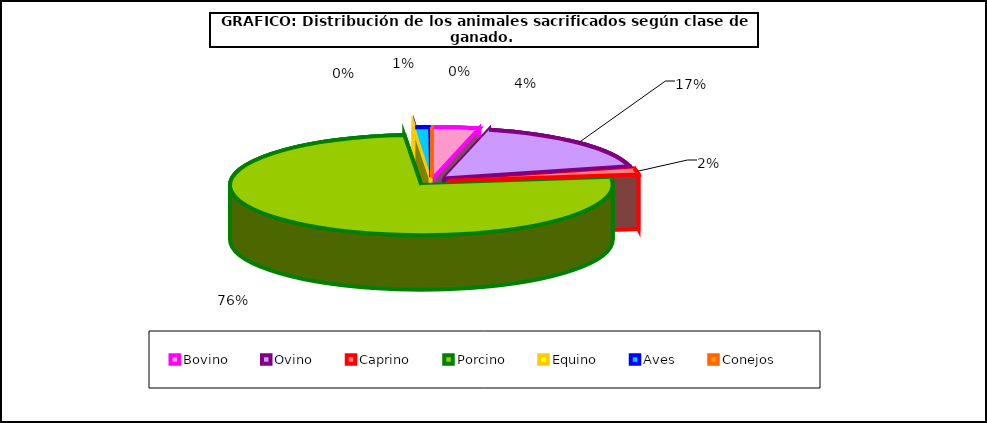
| Category | Series 0 |
|---|---|
| 0 | 2182590 |
| 1 | 9928191 |
| 2 | 1130215 |
| 3 | 43483573 |
| 4 | 48115 |
| 5 | 720093.857 |
| 6 | 52326.841 |